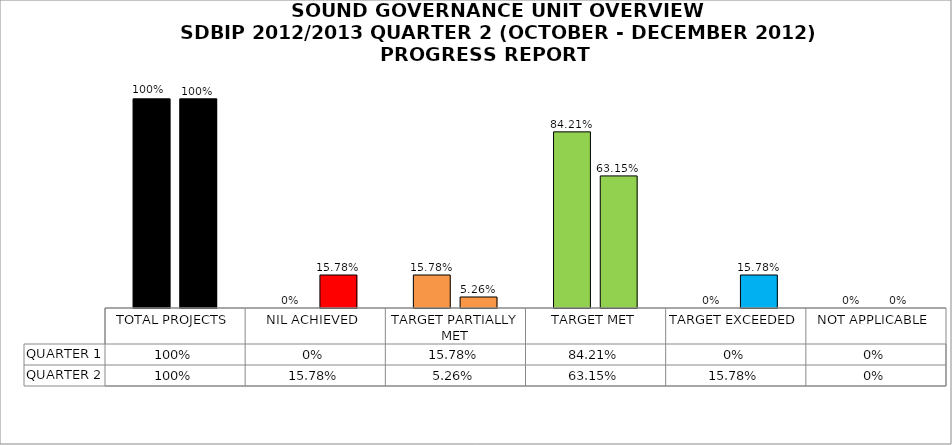
| Category | QUARTER 1 | QUARTER 2 |
|---|---|---|
| TOTAL PROJECTS | 1 | 1 |
| NIL ACHIEVED | 0 | 0.158 |
| TARGET PARTIALLY MET | 0.158 | 0.053 |
| TARGET MET | 0.842 | 0.632 |
| TARGET EXCEEDED | 0 | 0.158 |
| NOT APPLICABLE | 0 | 0 |